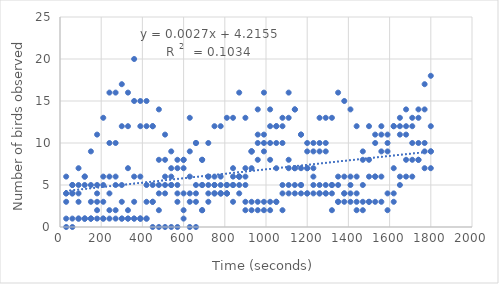
| Category | Series 0 |
|---|---|
| 30.0 | 1 |
| 60.0 | 1 |
| 90.0 | 1 |
| 120.0 | 1 |
| 150.0 | 1 |
| 180.0 | 2 |
| 210.0 | 3 |
| 240.0 | 10 |
| 270.0 | 10 |
| 300.0 | 12 |
| 330.0 | 12 |
| 360.0 | 15 |
| 390.0 | 15 |
| 420.0 | 15 |
| 450.0 | 12 |
| 480.0 | 8 |
| 510.0 | 8 |
| 540.0 | 7 |
| 570.0 | 7 |
| 600.0 | 8 |
| 630.0 | 9 |
| 660.0 | 10 |
| 690.0 | 8 |
| 720.0 | 6 |
| 750.0 | 6 |
| 780.0 | 5 |
| 810.0 | 5 |
| 840.0 | 6 |
| 870.0 | 6 |
| 900.0 | 7 |
| 930.0 | 9 |
| 960.0 | 11 |
| 990.0 | 11 |
| 1020.0 | 10 |
| 1050.0 | 7 |
| 1080.0 | 5 |
| 1110.0 | 7 |
| 1140.0 | 7 |
| 1170.0 | 7 |
| 1200.0 | 7 |
| 1230.0 | 7 |
| 1260.0 | 10 |
| 1290.0 | 10 |
| 1320.0 | 2 |
| 1350.0 | 3 |
| 1380.0 | 3 |
| 1410.0 | 3 |
| 1440.0 | 2 |
| 1470.0 | 2 |
| 1500.0 | 3 |
| 1530.0 | 6 |
| 1560.0 | 9 |
| 1590.0 | 10 |
| 1620.0 | 12 |
| 1650.0 | 13 |
| 1680.0 | 14 |
| 1710.0 | 13 |
| 1740.0 | 14 |
| 1770.0 | 17 |
| 1800.0 | 18 |
| 30.0 | 6 |
| 60.0 | 4 |
| 90.0 | 4 |
| 120.0 | 6 |
| 150.0 | 9 |
| 180.0 | 11 |
| 210.0 | 13 |
| 240.0 | 16 |
| 270.0 | 16 |
| 300.0 | 17 |
| 330.0 | 16 |
| 360.0 | 20 |
| 390.0 | 12 |
| 420.0 | 12 |
| 450.0 | 12 |
| 480.0 | 14 |
| 510.0 | 11 |
| 540.0 | 9 |
| 570.0 | 8 |
| 600.0 | 8 |
| 630.0 | 13 |
| 660.0 | 10 |
| 690.0 | 8 |
| 720.0 | 10 |
| 750.0 | 12 |
| 780.0 | 12 |
| 810.0 | 13 |
| 840.0 | 13 |
| 870.0 | 16 |
| 900.0 | 13 |
| 930.0 | 9 |
| 960.0 | 14 |
| 990.0 | 16 |
| 1020.0 | 14 |
| 1050.0 | 12 |
| 1080.0 | 13 |
| 1110.0 | 13 |
| 1140.0 | 14 |
| 1170.0 | 11 |
| 1200.0 | 9 |
| 1230.0 | 9 |
| 1260.0 | 9 |
| 1290.0 | 9 |
| 30.0 | 4 |
| 60.0 | 5 |
| 90.0 | 7 |
| 120.0 | 6 |
| 150.0 | 3 |
| 180.0 | 4 |
| 210.0 | 5 |
| 240.0 | 4 |
| 270.0 | 5 |
| 300.0 | 3 |
| 330.0 | 2 |
| 360.0 | 3 |
| 390.0 | 1 |
| 420.0 | 1 |
| 450.0 | 3 |
| 480.0 | 4 |
| 510.0 | 4 |
| 540.0 | 5 |
| 570.0 | 4 |
| 600.0 | 4 |
| 630.0 | 4 |
| 660.0 | 4 |
| 690.0 | 5 |
| 720.0 | 6 |
| 750.0 | 5 |
| 780.0 | 4 |
| 810.0 | 4 |
| 840.0 | 3 |
| 870.0 | 4 |
| 900.0 | 3 |
| 930.0 | 3 |
| 960.0 | 3 |
| 990.0 | 3 |
| 1020.0 | 3 |
| 1050.0 | 3 |
| 1080.0 | 4 |
| 1110.0 | 5 |
| 1140.0 | 5 |
| 1170.0 | 4 |
| 1200.0 | 4 |
| 1230.0 | 4 |
| 1260.0 | 5 |
| 1290.0 | 4 |
| 1320.0 | 5 |
| 1350.0 | 5 |
| 1380.0 | 4 |
| 1410.0 | 5 |
| 1440.0 | 3 |
| 1470.0 | 3 |
| 1500.0 | 3 |
| 1530.0 | 3 |
| 1560.0 | 3 |
| 1590.0 | 4 |
| 1620.0 | 4 |
| 1650.0 | 6 |
| 1680.0 | 6 |
| 1710.0 | 6 |
| 1740.0 | 8 |
| 1770.0 | 7 |
| 1800.0 | 7 |
| 30.0 | 4 |
| 60.0 | 5 |
| 90.0 | 5 |
| 120.0 | 5 |
| 150.0 | 5 |
| 180.0 | 5 |
| 210.0 | 6 |
| 240.0 | 6 |
| 270.0 | 6 |
| 300.0 | 5 |
| 330.0 | 7 |
| 360.0 | 6 |
| 390.0 | 6 |
| 420.0 | 5 |
| 450.0 | 5 |
| 480.0 | 5 |
| 510.0 | 6 |
| 540.0 | 6 |
| 570.0 | 5 |
| 600.0 | 7 |
| 630.0 | 6 |
| 660.0 | 5 |
| 690.0 | 5 |
| 720.0 | 4 |
| 750.0 | 5 |
| 780.0 | 6 |
| 810.0 | 4 |
| 840.0 | 7 |
| 870.0 | 6 |
| 900.0 | 6 |
| 930.0 | 9 |
| 960.0 | 10 |
| 990.0 | 10 |
| 1020.0 | 12 |
| 1050.0 | 12 |
| 1080.0 | 12 |
| 1110.0 | 16 |
| 1140.0 | 14 |
| 1170.0 | 11 |
| 1200.0 | 10 |
| 1230.0 | 10 |
| 1260.0 | 13 |
| 1290.0 | 13 |
| 1320.0 | 13 |
| 1350.0 | 16 |
| 1380.0 | 15 |
| 1410.0 | 14 |
| 1440.0 | 12 |
| 1470.0 | 9 |
| 1500.0 | 12 |
| 1530.0 | 11 |
| 1560.0 | 12 |
| 1590.0 | 9 |
| 1620.0 | 7 |
| 1650.0 | 11 |
| 1680.0 | 12 |
| 1710.0 | 10 |
| 1740.0 | 10 |
| 1770.0 | 9 |
| 1800.0 | 9 |
| 30.0 | 3 |
| 60.0 | 4 |
| 90.0 | 3 |
| 120.0 | 1 |
| 150.0 | 1 |
| 180.0 | 3 |
| 210.0 | 1 |
| 240.0 | 1 |
| 270.0 | 1 |
| 300.0 | 1 |
| 330.0 | 1 |
| 360.0 | 1 |
| 390.0 | 1 |
| 420.0 | 3 |
| 450.0 | 3 |
| 480.0 | 2 |
| 510.0 | 5 |
| 540.0 | 5 |
| 570.0 | 3 |
| 600.0 | 2 |
| 630.0 | 3 |
| 660.0 | 3 |
| 690.0 | 2 |
| 720.0 | 5 |
| 750.0 | 4 |
| 780.0 | 4 |
| 810.0 | 5 |
| 840.0 | 5 |
| 870.0 | 6 |
| 900.0 | 5 |
| 930.0 | 7 |
| 960.0 | 8 |
| 990.0 | 9 |
| 1020.0 | 8 |
| 1050.0 | 10 |
| 1080.0 | 10 |
| 1110.0 | 8 |
| 1140.0 | 7 |
| 1170.0 | 5 |
| 1200.0 | 7 |
| 1230.0 | 6 |
| 1260.0 | 4 |
| 1290.0 | 4 |
| 1320.0 | 4 |
| 1350.0 | 6 |
| 1380.0 | 6 |
| 1410.0 | 6 |
| 1440.0 | 4 |
| 1470.0 | 5 |
| 1500.0 | 6 |
| 1530.0 | 6 |
| 1560.0 | 6 |
| 1590.0 | 2 |
| 1620.0 | 3 |
| 1650.0 | 5 |
| 1680.0 | 8 |
| 1710.0 | 8 |
| 1740.0 | 8 |
| 1770.0 | 10 |
| 1800.0 | 9 |
| 30.0 | 0 |
| 60.0 | 0 |
| 90.0 | 1 |
| 120.0 | 1 |
| 150.0 | 1 |
| 180.0 | 1 |
| 210.0 | 1 |
| 240.0 | 2 |
| 270.0 | 2 |
| 300.0 | 1 |
| 330.0 | 1 |
| 360.0 | 1 |
| 390.0 | 1 |
| 420.0 | 1 |
| 450.0 | 0 |
| 480.0 | 0 |
| 510.0 | 0 |
| 540.0 | 0 |
| 570.0 | 0 |
| 600.0 | 1 |
| 630.0 | 0 |
| 660.0 | 0 |
| 690.0 | 2 |
| 720.0 | 3 |
| 750.0 | 4 |
| 780.0 | 4 |
| 810.0 | 4 |
| 840.0 | 5 |
| 870.0 | 5 |
| 900.0 | 2 |
| 930.0 | 2 |
| 960.0 | 2 |
| 990.0 | 2 |
| 1020.0 | 2 |
| 1050.0 | 3 |
| 1080.0 | 2 |
| 1110.0 | 4 |
| 1140.0 | 4 |
| 1170.0 | 5 |
| 1200.0 | 4 |
| 1230.0 | 5 |
| 1260.0 | 4 |
| 1290.0 | 5 |
| 1320.0 | 5 |
| 1350.0 | 3 |
| 1380.0 | 4 |
| 1410.0 | 4 |
| 1440.0 | 6 |
| 1470.0 | 8 |
| 1500.0 | 8 |
| 1530.0 | 10 |
| 1560.0 | 11 |
| 1590.0 | 11 |
| 1620.0 | 12 |
| 1650.0 | 12 |
| 1680.0 | 11 |
| 1710.0 | 12 |
| 1740.0 | 13 |
| 1770.0 | 14 |
| 1800.0 | 12 |